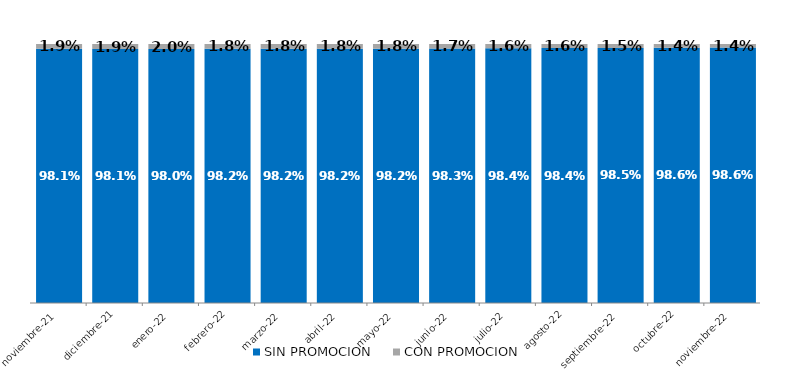
| Category | SIN PROMOCION   | CON PROMOCION   |
|---|---|---|
| 2021-11-01 | 0.981 | 0.019 |
| 2021-12-01 | 0.981 | 0.019 |
| 2022-01-01 | 0.98 | 0.02 |
| 2022-02-01 | 0.982 | 0.018 |
| 2022-03-01 | 0.982 | 0.018 |
| 2022-04-01 | 0.982 | 0.018 |
| 2022-05-01 | 0.982 | 0.018 |
| 2022-06-01 | 0.983 | 0.017 |
| 2022-07-01 | 0.984 | 0.016 |
| 2022-08-01 | 0.984 | 0.016 |
| 2022-09-01 | 0.985 | 0.015 |
| 2022-10-01 | 0.986 | 0.014 |
| 2022-11-01 | 0.986 | 0.014 |